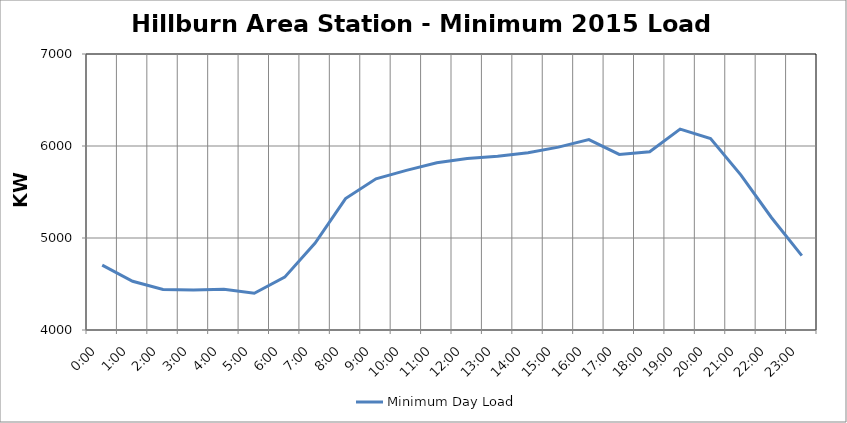
| Category | Minimum Day Load |
|---|---|
| 0.0 | 4705.68 |
| 0.041666666666666664 | 4529.28 |
| 0.08333333333333333 | 4440.24 |
| 0.125 | 4435.2 |
| 0.16666666666666666 | 4443.6 |
| 0.20833333333333334 | 4399.92 |
| 0.25 | 4574.64 |
| 0.2916666666666667 | 4945.92 |
| 0.3333333333333333 | 5428.08 |
| 0.375 | 5643.12 |
| 0.4166666666666667 | 5735.52 |
| 0.4583333333333333 | 5817.84 |
| 0.5 | 5864.88 |
| 0.5416666666666666 | 5888.4 |
| 0.5833333333333334 | 5927.04 |
| 0.625 | 5987.52 |
| 0.6666666666666666 | 6069.84 |
| 0.7083333333333334 | 5908.56 |
| 0.75 | 5937.12 |
| 0.7916666666666666 | 6184.08 |
| 0.8333333333333334 | 6081.6 |
| 0.875 | 5683.44 |
| 0.9166666666666666 | 5223.12 |
| 0.9583333333333334 | 4808.16 |